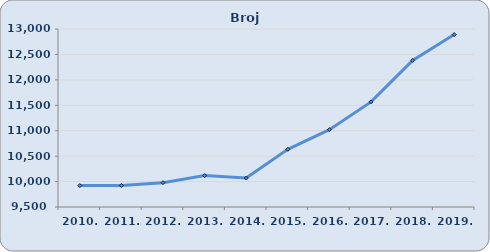
| Category | Broj zaposlenih |
|---|---|
| 2010. | 9921 |
| 2011. | 9923 |
| 2012. | 9979 |
| 2013. | 10118 |
| 2014. | 10070 |
| 2015. | 10634 |
| 2016. | 11021 |
| 2017. | 11566 |
| 2018. | 12383 |
| 2019. | 12890 |